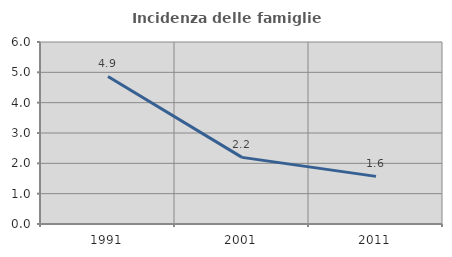
| Category | Incidenza delle famiglie numerose |
|---|---|
| 1991.0 | 4.864 |
| 2001.0 | 2.196 |
| 2011.0 | 1.57 |